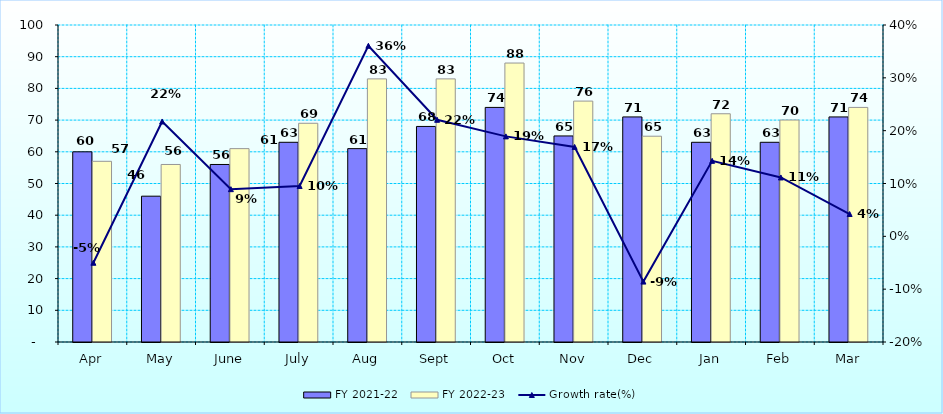
| Category | FY 2021-22 | FY 2022-23 |
|---|---|---|
| Apr | 60 | 57 |
| May | 46 | 56 |
| June | 56 | 61 |
| July | 63 | 69 |
| Aug | 61 | 83 |
| Sept | 68 | 83 |
| Oct | 74 | 88 |
| Nov | 65 | 76 |
| Dec | 71 | 64.918 |
| Jan | 63 | 72 |
| Feb | 63 | 70.02 |
| Mar | 71 | 74 |